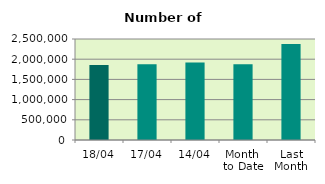
| Category | Series 0 |
|---|---|
| 18/04 | 1853852 |
| 17/04 | 1877230 |
| 14/04 | 1918534 |
| Month 
to Date | 1873661.2 |
| Last
Month | 2375448 |